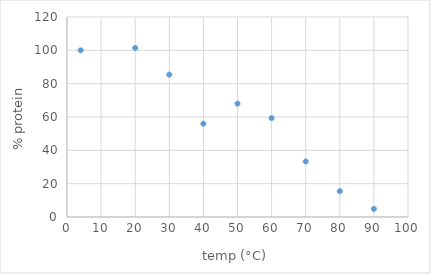
| Category | Series 0 |
|---|---|
| 4.0 | 100 |
| 20.0 | 101.46 |
| 30.0 | 85.434 |
| 40.0 | 55.981 |
| 50.0 | 68.016 |
| 60.0 | 59.334 |
| 70.0 | 33.321 |
| 80.0 | 15.458 |
| 90.0 | 4.874 |